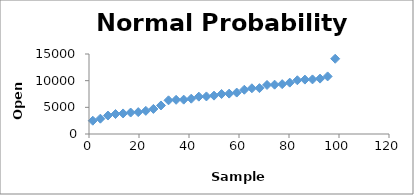
| Category | Series 0 |
|---|---|
| 1.5151515151515151 | 2492.6 |
| 4.545454545454545 | 2871.3 |
| 7.575757575757576 | 3460.547 |
| 10.606060606060606 | 3746.713 |
| 13.636363636363637 | 3853.757 |
| 16.666666666666668 | 4024.464 |
| 19.696969696969695 | 4105.362 |
| 22.727272727272727 | 4341.05 |
| 25.757575757575758 | 4701.76 |
| 28.78787878787879 | 5350.915 |
| 31.81818181818182 | 6318.14 |
| 34.84848484848485 | 6411.68 |
| 37.878787878787875 | 6440.97 |
| 40.90909090909091 | 6619.85 |
| 43.93939393939394 | 7003.06 |
| 46.96969696969697 | 7044.81 |
| 50.0 | 7194.892 |
| 53.03030303030303 | 7500.7 |
| 56.06060606060606 | 7571.616 |
| 59.09090909090909 | 7769.04 |
| 62.121212121212125 | 8299.721 |
| 65.15151515151514 | 8573.84 |
| 68.18181818181819 | 8599.759 |
| 71.21212121212122 | 9193.992 |
| 74.24242424242424 | 9251.47 |
| 77.27272727272727 | 9346.357 |
| 80.3030303030303 | 9630.593 |
| 83.33333333333333 | 10077.442 |
| 86.36363636363636 | 10198.6 |
| 89.39393939393939 | 10237.3 |
| 92.42424242424242 | 10385 |
| 95.45454545454545 | 10796.931 |
| 98.48484848484848 | 14112.2 |